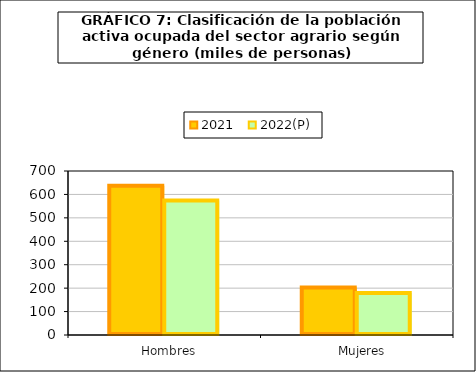
| Category | 2021 | 2022(P) |
|---|---|---|
|    Hombres | 637.1 | 574 |
|    Mujeres | 203 | 179.3 |